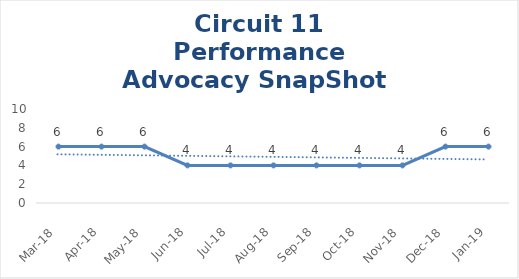
| Category | Circuit 11 |
|---|---|
| Mar-18 | 6 |
| Apr-18 | 6 |
| May-18 | 6 |
| Jun-18 | 4 |
| Jul-18 | 4 |
| Aug-18 | 4 |
| Sep-18 | 4 |
| Oct-18 | 4 |
| Nov-18 | 4 |
| Dec-18 | 6 |
| Jan-19 | 6 |